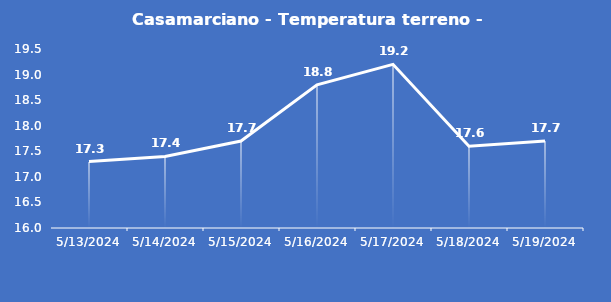
| Category | Casamarciano - Temperatura terreno - Grezzo (°C) |
|---|---|
| 5/13/24 | 17.3 |
| 5/14/24 | 17.4 |
| 5/15/24 | 17.7 |
| 5/16/24 | 18.8 |
| 5/17/24 | 19.2 |
| 5/18/24 | 17.6 |
| 5/19/24 | 17.7 |